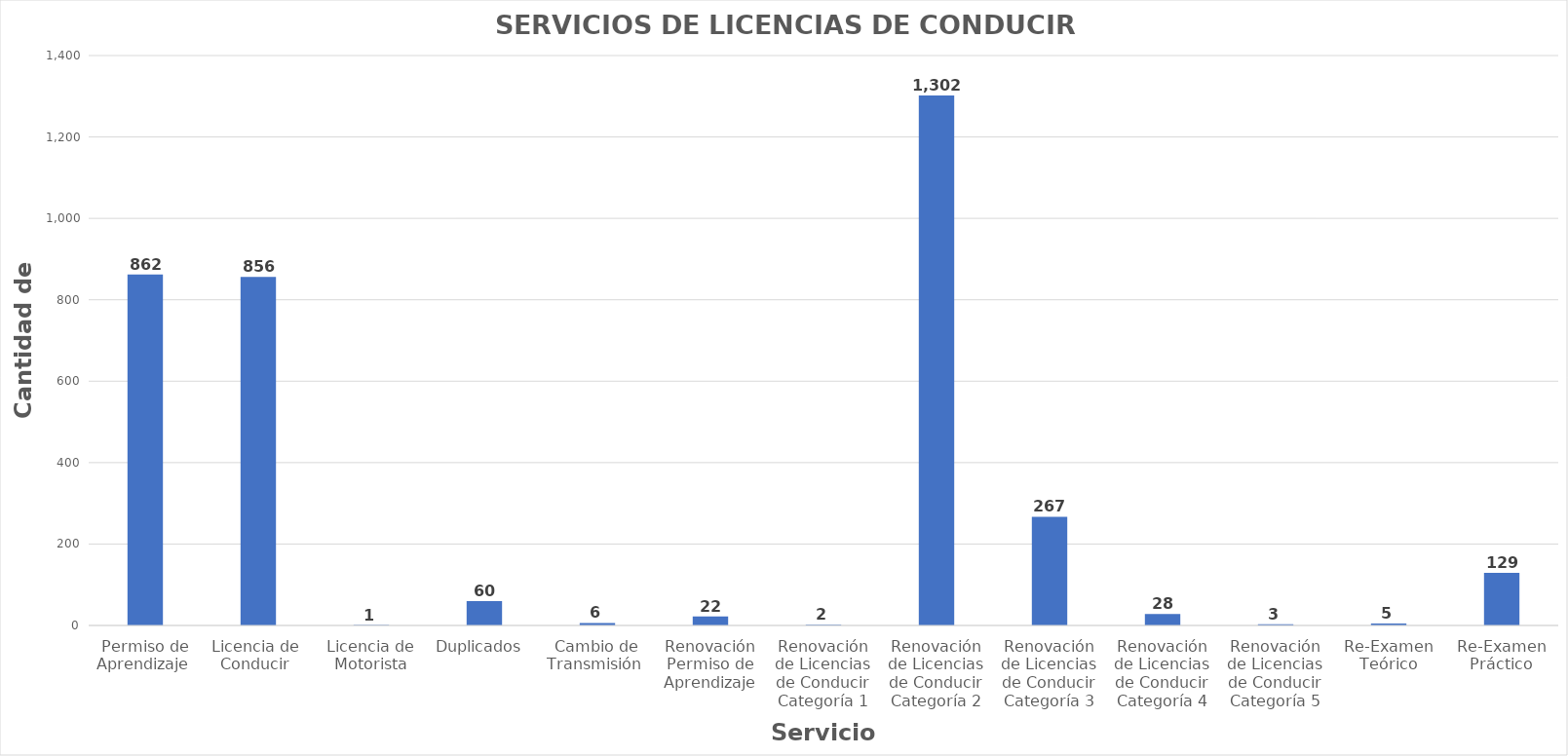
| Category | Series 0 |
|---|---|
| Permiso de Aprendizaje  | 862 |
| Licencia de  Conducir  | 856 |
| Licencia de Motorista | 1 |
| Duplicados  | 60 |
| Cambio de Transmisión  | 6 |
| Renovación Permiso de Aprendizaje | 22 |
| Renovación de Licencias de Conducir Categoría 1 | 2 |
| Renovación de Licencias de Conducir Categoría 2 | 1302 |
| Renovación de Licencias de Conducir Categoría 3 | 267 |
| Renovación de Licencias de Conducir Categoría 4 | 28 |
| Renovación de Licencias de Conducir Categoría 5 | 3 |
| Re-Examen Teórico | 5 |
| Re-Examen Práctico | 129 |